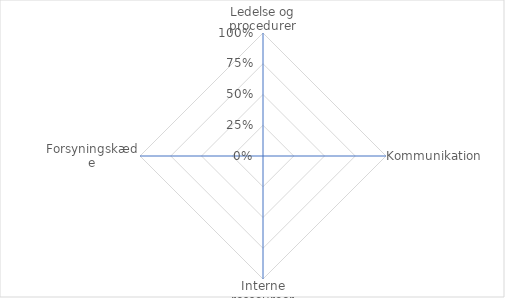
| Category | Series 0 |
|---|---|
| Ledelse og procedurer | 0 |
| Kommunikation | 0 |
| Interne ressourcer | 0 |
| Forsyningskæde | 0 |